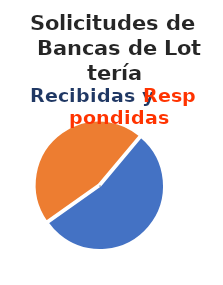
| Category | Series 0 |
|---|---|
| 0 | 33 |
| 1 | 28 |